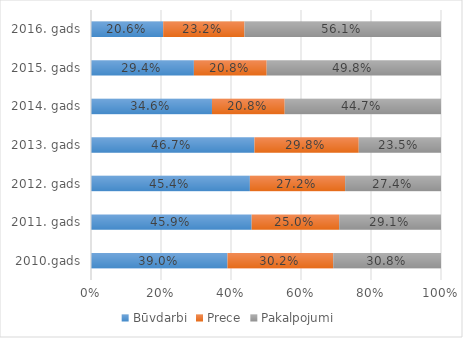
| Category | Būvdarbi | Prece | Pakalpojumi |
|---|---|---|---|
| 2010.gads | 0.39 | 0.302 | 0.308 |
| 2011. gads | 0.459 | 0.25 | 0.291 |
| 2012. gads | 0.454 | 0.272 | 0.274 |
| 2013. gads | 0.467 | 0.298 | 0.235 |
| 2014. gads | 0.346 | 0.208 | 0.447 |
| 2015. gads | 0.294 | 0.208 | 0.498 |
| 2016. gads | 0.206 | 0.232 | 0.561 |